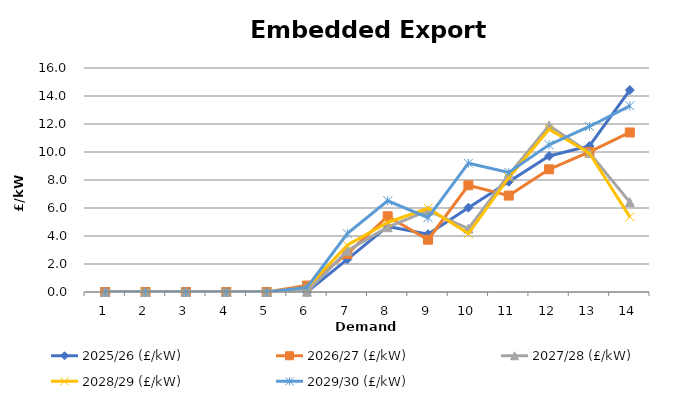
| Category | 2025/26 (£/kW) | 2026/27 (£/kW) | 2027/28 (£/kW) | 2028/29 (£/kW) | 2029/30 (£/kW) |
|---|---|---|---|---|---|
| 1.0 | 0 | 0 | 0 | 0 | 0 |
| 2.0 | 0 | 0 | 0 | 0 | 0 |
| 3.0 | 0 | 0 | 0 | 0 | 0 |
| 4.0 | 0 | 0 | 0 | 0 | 0 |
| 5.0 | 0 | 0 | 0 | 0 | 0 |
| 6.0 | 0 | 0.46 | 0.019 | 0.311 | 0.323 |
| 7.0 | 2.334 | 2.725 | 2.951 | 3.347 | 4.167 |
| 8.0 | 4.683 | 5.41 | 4.628 | 4.966 | 6.516 |
| 9.0 | 4.128 | 3.734 | 5.808 | 5.984 | 5.307 |
| 10.0 | 6.026 | 7.621 | 4.532 | 4.175 | 9.199 |
| 11.0 | 7.875 | 6.887 | 8.356 | 8.164 | 8.543 |
| 12.0 | 9.714 | 8.762 | 11.894 | 11.628 | 10.515 |
| 13.0 | 10.429 | 10.007 | 9.931 | 9.907 | 11.823 |
| 14.0 | 14.424 | 11.396 | 6.416 | 5.368 | 13.298 |